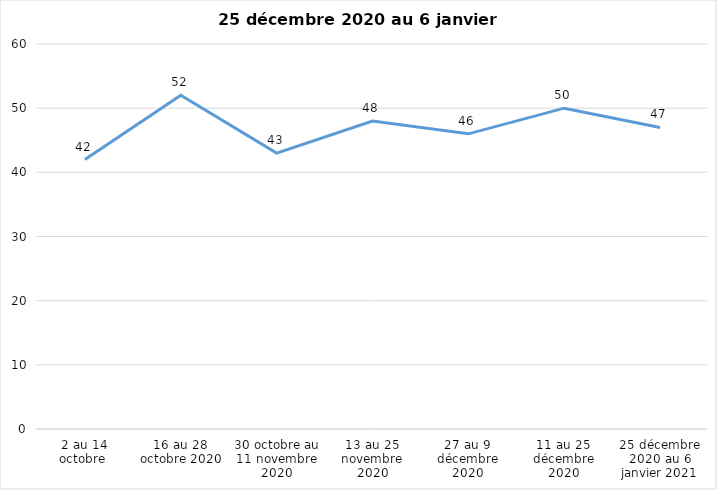
| Category | Toujours aux trois mesures |
|---|---|
| 2 au 14 octobre  | 42 |
| 16 au 28 octobre 2020 | 52 |
| 30 octobre au 11 novembre 2020 | 43 |
| 13 au 25 novembre 2020 | 48 |
| 27 au 9 décembre 2020 | 46 |
| 11 au 25 décembre 2020 | 50 |
| 25 décembre 2020 au 6 janvier 2021 | 47 |